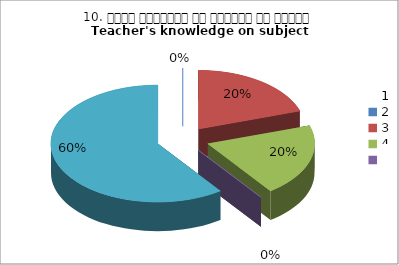
| Category | 10. विषय अवधारणा पर शिक्षक का ज्ञान
Teacher's knowledge on subject concept?
 |
|---|---|
| 0 | 0 |
| 1 | 1 |
| 2 | 1 |
| 3 | 0 |
| 4 | 3 |